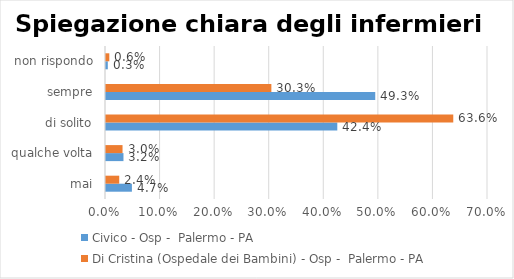
| Category | Civico - Osp -  Palermo - PA | Di Cristina (Ospedale dei Bambini) - Osp -  Palermo - PA |
|---|---|---|
| mai | 0.047 | 0.024 |
| qualche volta | 0.032 | 0.03 |
| di solito | 0.424 | 0.636 |
| sempre | 0.493 | 0.303 |
| non rispondo | 0.003 | 0.006 |